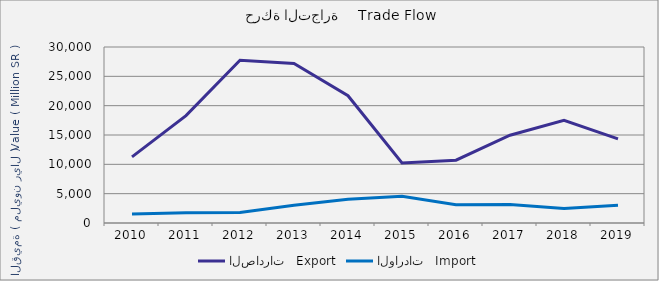
| Category | الصادرات   Export | الواردات   Import |
|---|---|---|
| 2010.0 | 11266896440 | 1543486011 |
| 2011.0 | 18301574832 | 1738136112 |
| 2012.0 | 27754927342 | 1797587604 |
| 2013.0 | 27208165833 | 3042459596 |
| 2014.0 | 21689323916 | 4064367030 |
| 2015.0 | 10220368610 | 4572152106 |
| 2016.0 | 10701425974 | 3103426801 |
| 2017.0 | 14957714084 | 3151877367 |
| 2018.0 | 17496129878 | 2467487145 |
| 2019.0 | 14340560224 | 3016570552 |